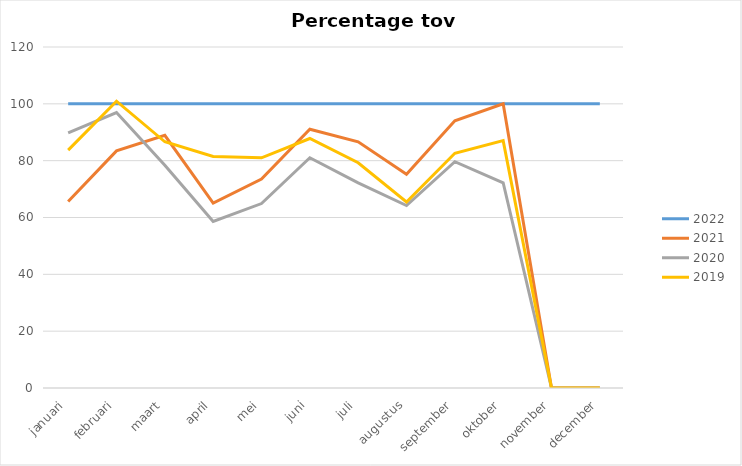
| Category | 2022 | 2021 | 2020 | 2019 |
|---|---|---|---|---|
| januari | 100 | 65.617 | 89.764 | 83.727 |
| februari | 100 | 83.436 | 96.933 | 100.92 |
| maart | 100 | 88.92 | 78.409 | 86.648 |
| april | 100 | 65.039 | 58.612 | 81.491 |
| mei | 100 | 73.558 | 64.904 | 81.01 |
| juni | 100 | 91.057 | 81.03 | 87.805 |
| juli | 100 | 86.648 | 72.159 | 79.261 |
| augustus | 100 | 75.245 | 64.216 | 65.441 |
| september | 100 | 94.022 | 79.62 | 82.609 |
| oktober | 100 | 100 | 72.222 | 87.037 |
| november | 100 | 0 | 0 | 0 |
| december | 100 | 0 | 0 | 0 |